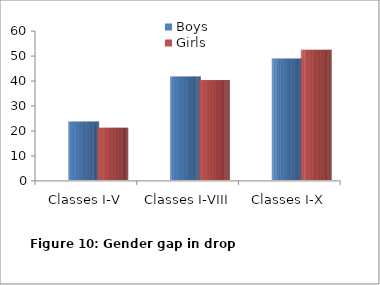
| Category | Boys | Girls |
|---|---|---|
| Classes I-V | 23.415 | 20.955 |
| Classes I-VIII | 41.453 | 40.031 |
| Classes I-X | 48.636 | 52.161 |